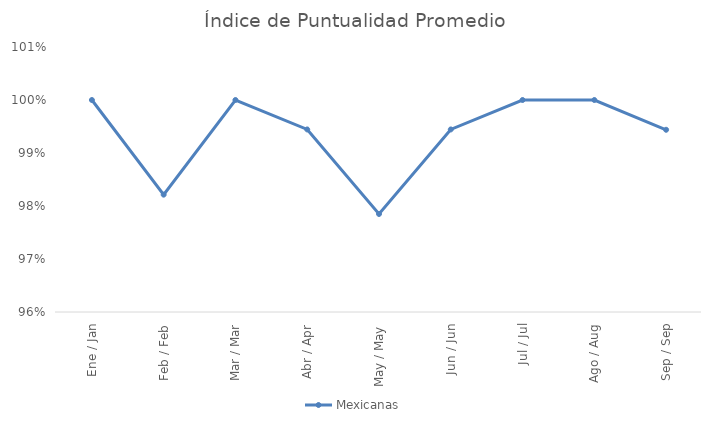
| Category | Mexicanas |
|---|---|
| Ene / Jan | 1 |
| Feb / Feb | 0.982 |
| Mar / Mar | 1 |
| Abr / Apr | 0.994 |
| May / May | 0.978 |
| Jun / Jun | 0.994 |
| Jul / Jul | 1 |
| Ago / Aug | 1 |
| Sep / Sep | 0.994 |